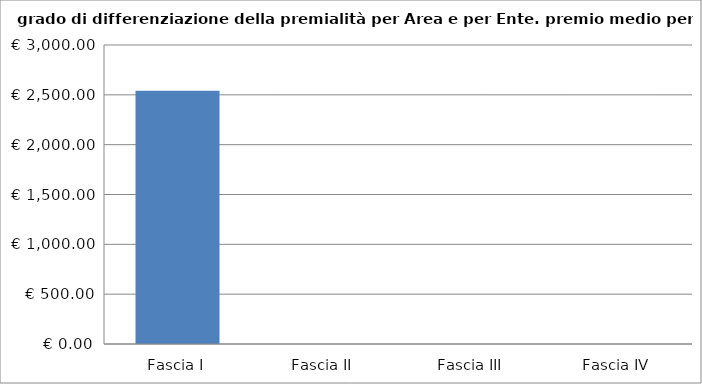
| Category | Totale ente |
|---|---|
| Fascia I | 2541.667 |
| Fascia II | 0 |
| Fascia III | 0 |
| Fascia IV | 0 |